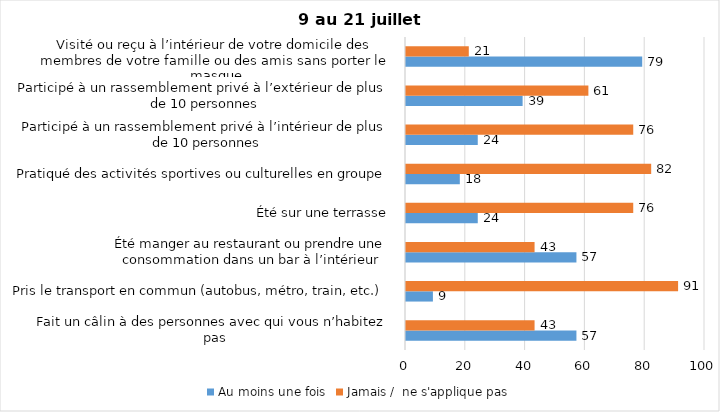
| Category | Au moins une fois | Jamais /  ne s'applique pas |
|---|---|---|
| Fait un câlin à des personnes avec qui vous n’habitez pas | 57 | 43 |
| Pris le transport en commun (autobus, métro, train, etc.) | 9 | 91 |
| Été manger au restaurant ou prendre une consommation dans un bar à l’intérieur | 57 | 43 |
| Été sur une terrasse | 24 | 76 |
| Pratiqué des activités sportives ou culturelles en groupe | 18 | 82 |
| Participé à un rassemblement privé à l’intérieur de plus de 10 personnes | 24 | 76 |
| Participé à un rassemblement privé à l’extérieur de plus de 10 personnes | 39 | 61 |
| Visité ou reçu à l’intérieur de votre domicile des membres de votre famille ou des amis sans porter le masque | 79 | 21 |